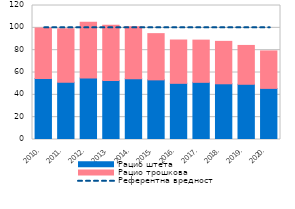
| Category | Рацио штета | Рацио трошкова |
|---|---|---|
| 2010. | 54.72 | 45.23 |
| 2011. | 51.18 | 48.09 |
| 2012. | 55 | 50.1 |
| 2013. | 52.8 | 49.6 |
| 2014. | 54.4 | 46.5 |
| 2015. | 53.4 | 41.4 |
| 2016. | 50.3 | 38.8 |
| 2017. | 51.2 | 37.8 |
| 2018. | 49.89 | 37.99 |
| 2019. | 49.46 | 34.78 |
| 2020. | 45.77 | 33.56 |